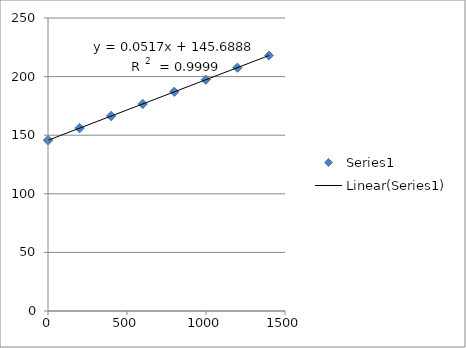
| Category | Series 0 |
|---|---|
| 0.0 | 145.3 |
| 199.8 | 155.8 |
| 399.6 | 166.1 |
| 599.4000000000001 | 176.5 |
| 799.2 | 186.9 |
| 999.0 | 197.3 |
| 1198.8000000000002 | 207.6 |
| 1398.6000000000001 | 218 |
| 1198.8000000000002 | 207.6 |
| 999.0 | 197.4 |
| 799.2 | 187.2 |
| 599.4000000000001 | 176.8 |
| 399.6 | 166.6 |
| 199.8 | 156.3 |
| 0.0 | 146 |